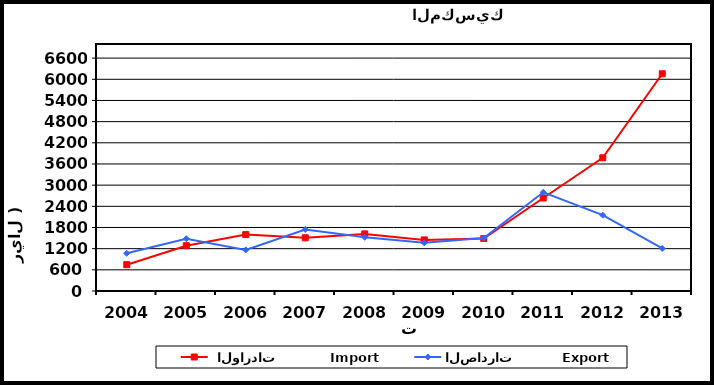
| Category |  الواردات           Import | الصادرات          Export |
|---|---|---|
| 2004.0 | 746 | 1068 |
| 2005.0 | 1284 | 1481 |
| 2006.0 | 1598 | 1165 |
| 2007.0 | 1508 | 1743 |
| 2008.0 | 1618 | 1522 |
| 2009.0 | 1448 | 1364 |
| 2010.0 | 1486 | 1503 |
| 2011.0 | 2636 | 2798 |
| 2012.0 | 3775 | 2149 |
| 2013.0 | 6156 | 1205 |